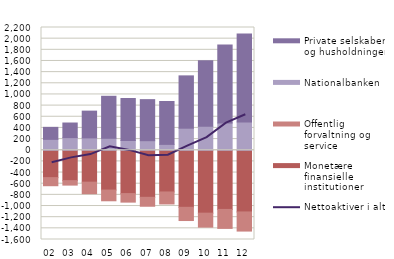
| Category | Monetære finansielle institutioner | Offentlig forvaltning og service | Nationalbanken | Private selskaber og husholdninger |
|---|---|---|---|---|
| 02 | -491 | -145 | 195 | 215 |
| 03 | -545 | -80 | 226 | 262 |
| 04 | -572 | -207 | 221 | 480 |
| 05 | -714 | -192 | 214 | 753 |
| 06 | -777 | -153 | 174 | 753 |
| 07 | -844 | -160 | 171 | 736 |
| 08 | -748 | -215 | 105 | 769 |
| 09 | -1023 | -237 | 395 | 938 |
| 10 | -1128 | -250 | 428 | 1177 |
| 11 | -1061 | -340 | 487 | 1400 |
| 12 | -1106 | -343 | 507 | 1578 |